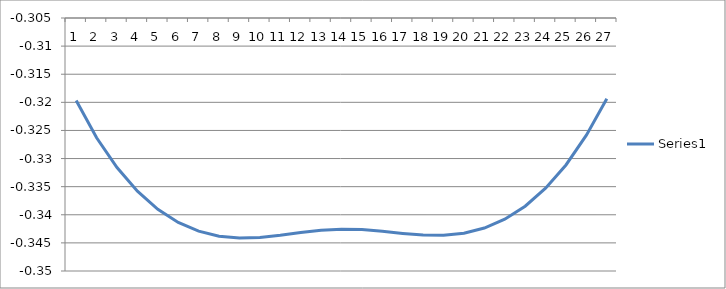
| Category | Series 0 |
|---|---|
| 0 | -0.32 |
| 1 | -0.326 |
| 2 | -0.332 |
| 3 | -0.336 |
| 4 | -0.339 |
| 5 | -0.341 |
| 6 | -0.343 |
| 7 | -0.344 |
| 8 | -0.344 |
| 9 | -0.344 |
| 10 | -0.344 |
| 11 | -0.343 |
| 12 | -0.343 |
| 13 | -0.343 |
| 14 | -0.343 |
| 15 | -0.343 |
| 16 | -0.343 |
| 17 | -0.344 |
| 18 | -0.344 |
| 19 | -0.343 |
| 20 | -0.342 |
| 21 | -0.341 |
| 22 | -0.338 |
| 23 | -0.335 |
| 24 | -0.331 |
| 25 | -0.326 |
| 26 | -0.319 |